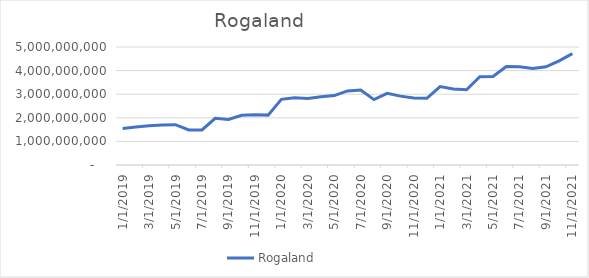
| Category | Rogaland |
|---|---|
| 1/1/19 | 1545890000 |
| 2/1/19 | 1614212916.667 |
| 3/1/19 | 1661450416.667 |
| 4/1/19 | 1697792083.333 |
| 5/1/19 | 1708487916.667 |
| 6/1/19 | 1483252500 |
| 7/1/19 | 1484069166.667 |
| 8/1/19 | 1980590000 |
| 9/1/19 | 1926880000 |
| 10/1/19 | 2103663333.333 |
| 11/1/19 | 2132880000 |
| 12/1/19 | 2113388333.333 |
| 1/1/20 | 2782126666.667 |
| 2/1/20 | 2851764166.667 |
| 3/1/20 | 2823061666.667 |
| 4/1/20 | 2891899166.667 |
| 5/1/20 | 2941228333.333 |
| 6/1/20 | 3138963750 |
| 7/1/20 | 3173867916.667 |
| 8/1/20 | 2771226250 |
| 9/1/20 | 3033706250 |
| 10/1/20 | 2917616250 |
| 11/1/20 | 2839242916.667 |
| 12/1/20 | 2826540416.667 |
| 1/1/21 | 3320160000 |
| 2/1/21 | 3216376666.667 |
| 3/1/21 | 3190837500 |
| 4/1/21 | 3743187500 |
| 5/1/21 | 3749512500 |
| 6/1/21 | 4173577083.333 |
| 7/1/21 | 4163485416.667 |
| 8/1/21 | 4088281250 |
| 9/1/21 | 4161437083.333 |
| 10/1/21 | 4409845416.667 |
| 11/1/21 | 4717092083.333 |